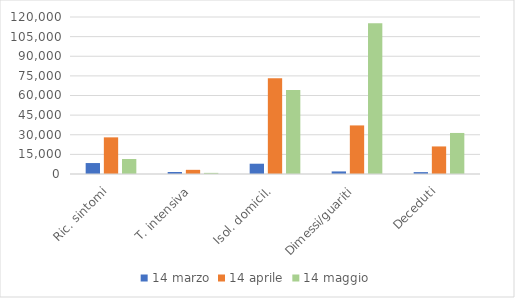
| Category | 14 marzo | 14 aprile | 14 maggio |
|---|---|---|---|
| Ric. sintomi | 8372 | 28011 | 11453 |
| T. intensiva | 1518 | 3186 | 855 |
| Isol. domicil. | 7860 | 73094 | 64132 |
| Dimessi/guariti | 1966 | 37130 | 115288 |
| Deceduti | 1441 | 21067 | 31368 |